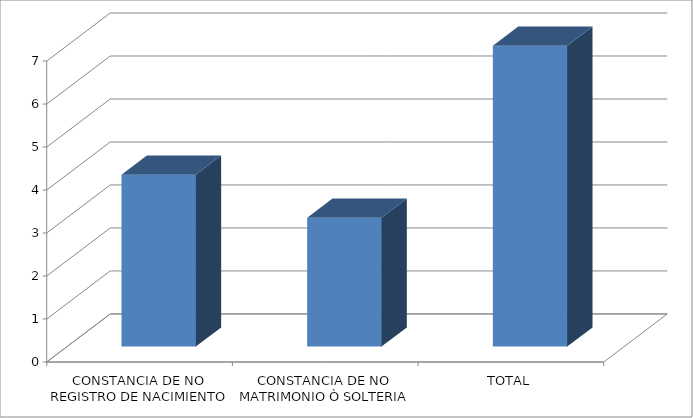
| Category | Series 0 |
|---|---|
| CONSTANCIA DE NO REGISTRO DE NACIMIENTO | 4 |
| CONSTANCIA DE NO MATRIMONIO Ò SOLTERIA | 3 |
| TOTAL | 7 |